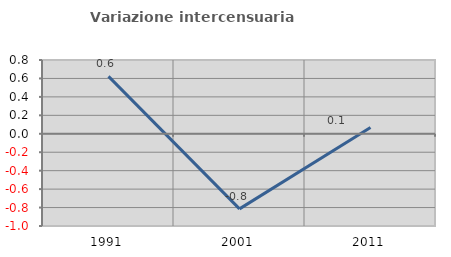
| Category | Variazione intercensuaria annua |
|---|---|
| 1991.0 | 0.622 |
| 2001.0 | -0.814 |
| 2011.0 | 0.068 |